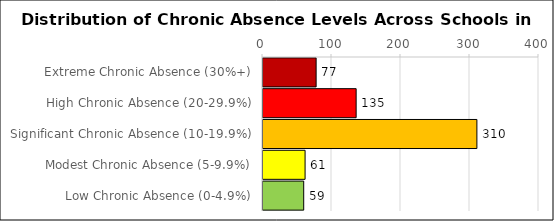
| Category | Number of Schools |
|---|---|
| Extreme Chronic Absence (30%+) | 77 |
| High Chronic Absence (20-29.9%) | 135 |
| Significant Chronic Absence (10-19.9%) | 310 |
| Modest Chronic Absence (5-9.9%) | 61 |
| Low Chronic Absence (0-4.9%) | 59 |